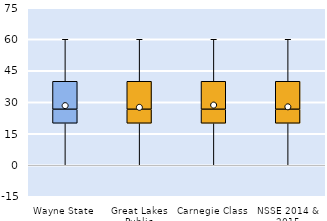
| Category | 25th | 50th | 75th |
|---|---|---|---|
| Wayne State | 20 | 6.667 | 13.333 |
| Great Lakes Public | 20 | 6.667 | 13.333 |
| Carnegie Class | 20 | 6.667 | 13.333 |
| NSSE 2014 & 2015 | 20 | 6.667 | 13.333 |